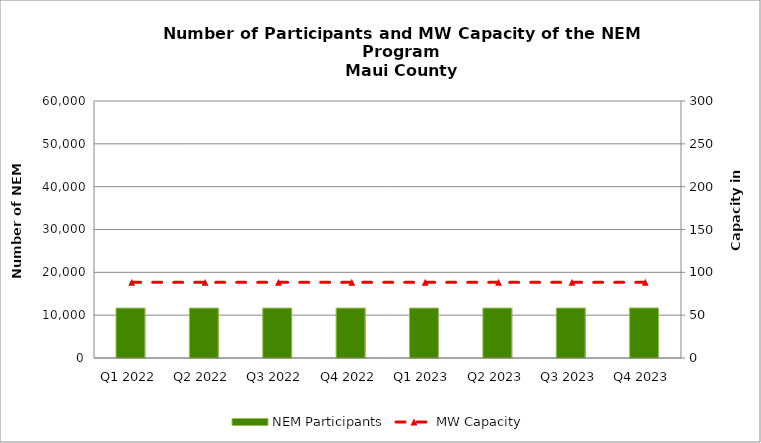
| Category | NEM Participants |
|---|---|
| Q1 2022 | 11647 |
| Q2 2022 | 11649 |
| Q3 2022 | 11651 |
| Q4 2022 | 11651 |
| Q1 2023 | 11651 |
| Q2 2023 | 11656 |
| Q3 2023 | 11663 |
| Q4 2023 | 11685 |